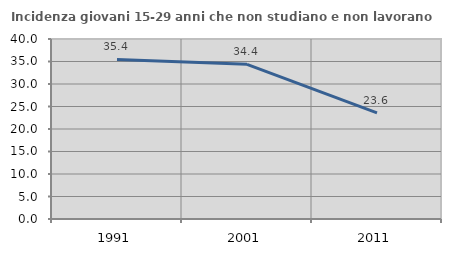
| Category | Incidenza giovani 15-29 anni che non studiano e non lavorano  |
|---|---|
| 1991.0 | 35.449 |
| 2001.0 | 34.374 |
| 2011.0 | 23.57 |